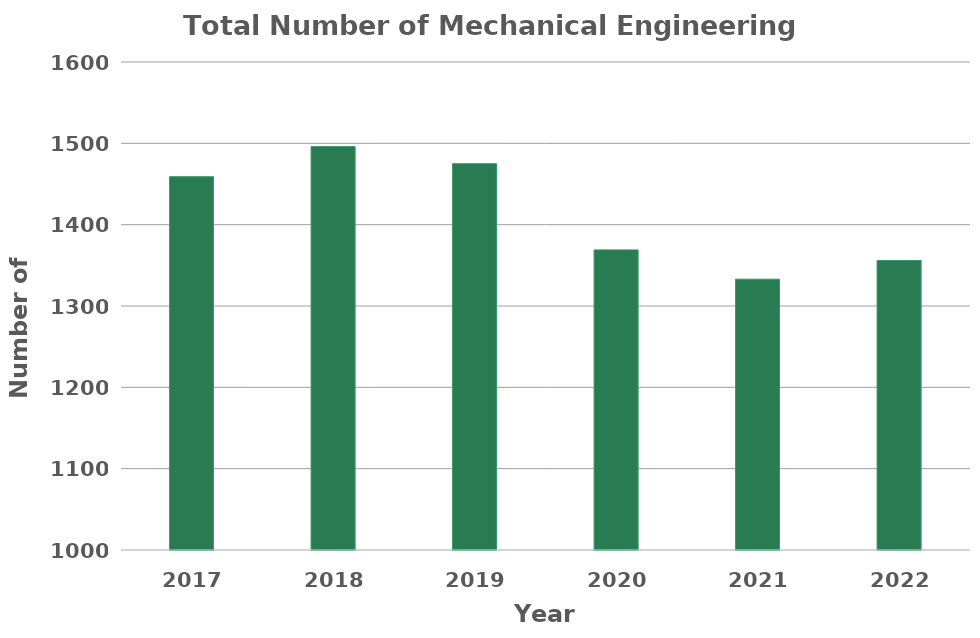
| Category | Total Number of Mechanical Engineering Students |
|---|---|
| 2017.0 | 1459 |
| 2018.0 | 1496 |
| 2019.0 | 1475 |
| 2020.0 | 1369 |
| 2021.0 | 1333 |
| 2022.0 | 1356 |